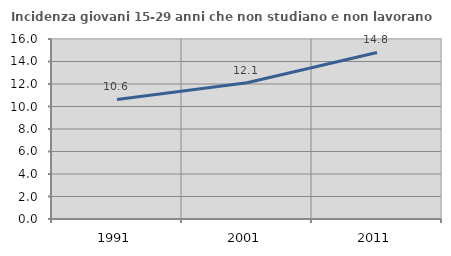
| Category | Incidenza giovani 15-29 anni che non studiano e non lavorano  |
|---|---|
| 1991.0 | 10.626 |
| 2001.0 | 12.108 |
| 2011.0 | 14.803 |